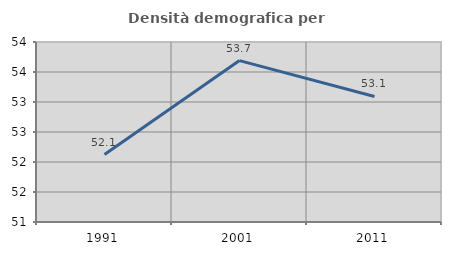
| Category | Densità demografica |
|---|---|
| 1991.0 | 52.124 |
| 2001.0 | 53.69 |
| 2011.0 | 53.092 |